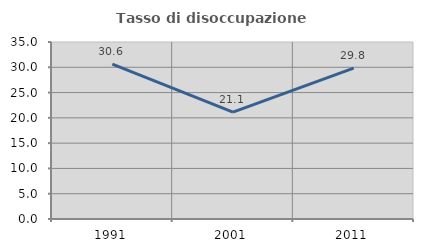
| Category | Tasso di disoccupazione giovanile  |
|---|---|
| 1991.0 | 30.636 |
| 2001.0 | 21.145 |
| 2011.0 | 29.825 |